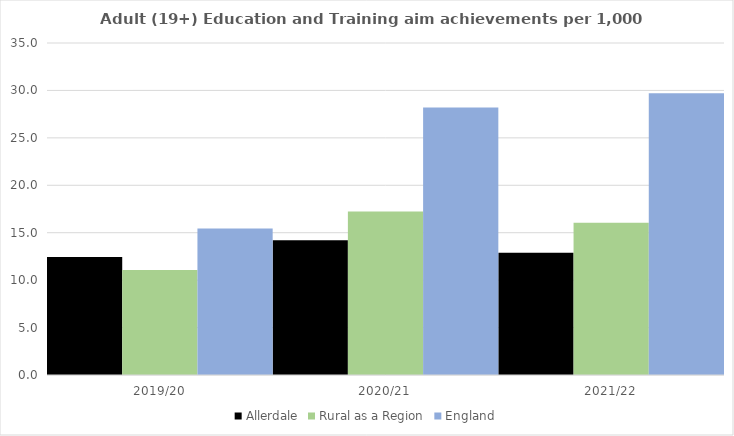
| Category | Allerdale | Rural as a Region | England |
|---|---|---|---|
| 2019/20 | 12.446 | 11.081 | 15.446 |
| 2020/21 | 14.209 | 17.224 | 28.211 |
| 2021/22 | 12.876 | 16.063 | 29.711 |